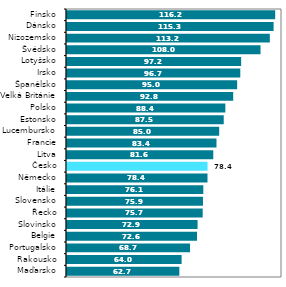
| Category | Series 0 |
|---|---|
| Maďarsko | 62.71 |
| Rakousko | 63.97 |
| Portugalsko | 68.68 |
| Belgie | 72.56 |
| Slovinsko | 72.88 |
| Řecko | 75.73 |
| Slovensko | 75.89 |
| Itálie | 76.08 |
| Německo | 78.42 |
| Česko | 78.44 |
| Litva | 81.64 |
| Francie | 83.43 |
| Lucembursko | 84.95 |
| Estonsko | 87.48 |
| Polsko | 88.38 |
| Velká Británie | 92.76 |
| Španělsko | 94.97 |
| Irsko | 96.72 |
| Lotyšsko | 97.2 |
| Švédsko | 108.02 |
| Nizozemsko | 113.2 |
| Dánsko | 115.31 |
| Finsko | 116.2 |